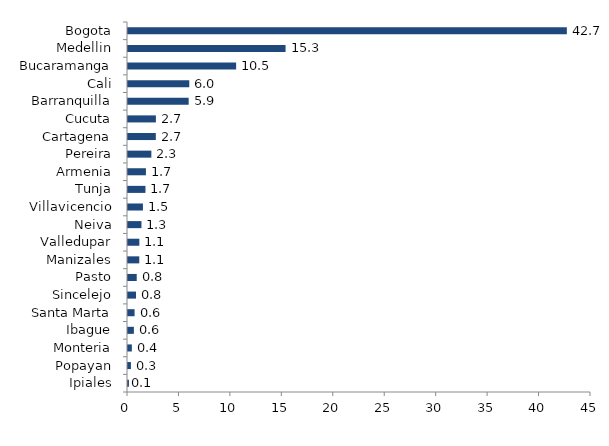
| Category | Series 0 |
|---|---|
| Ipiales | 0.092 |
| Popayan | 0.285 |
| Monteria | 0.374 |
| Ibague | 0.571 |
| Santa Marta | 0.639 |
| Sincelejo | 0.776 |
| Pasto | 0.848 |
| Manizales | 1.095 |
| Valledupar | 1.103 |
| Neiva | 1.31 |
| Villavicencio | 1.451 |
| Tunja | 1.697 |
| Armenia | 1.743 |
| Pereira | 2.27 |
| Cartagena | 2.703 |
| Cucuta | 2.71 |
| Barranquilla | 5.897 |
| Cali | 5.957 |
| Bucaramanga | 10.51 |
| Medellin | 15.314 |
| Bogota | 42.654 |